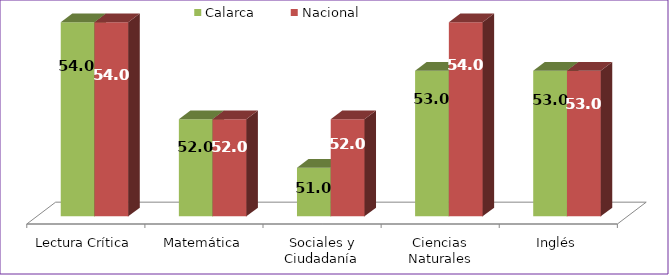
| Category | Calarca | Nacional |
|---|---|---|
| Lectura Crítica | 54 | 54 |
| Matemática | 52 | 52 |
| Sociales y Ciudadanía | 51 | 52 |
| Ciencias Naturales | 53 | 54 |
| Inglés | 53 | 53 |